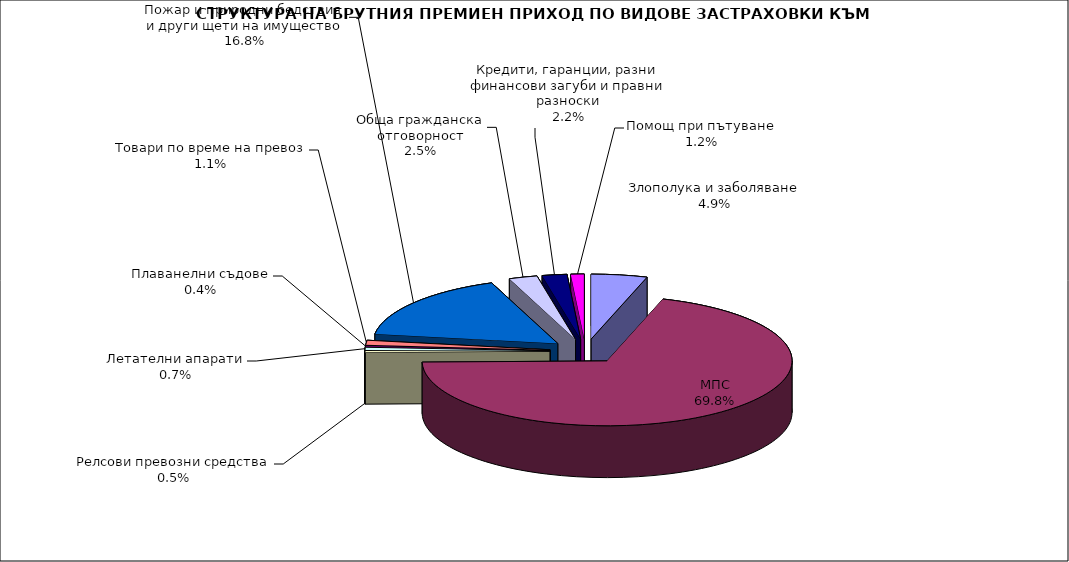
| Category | Злополука и заболяване МПС Релсови превозни средства Летателни апарати Плаванелни съдове Товари по време на превоз Пожар и природни бедствия и други щети на имущество Обща гражданска отговорност Кредити, гаранции, разни финансови загуби и правни разноски  |
|---|---|
| Злополука и заболяване | 0.049 |
| МПС | 0.698 |
| Релсови превозни средства | 0.005 |
| Летателни апарати | 0.007 |
| Плаванелни съдове | 0.004 |
| Товари по време на превоз | 0.011 |
| Пожар и природни бедствия и други щети на имущество | 0.168 |
| Обща гражданска отговорност | 0.025 |
| Кредити, гаранции, разни финансови загуби и правни разноски | 0.022 |
| Помощ при пътуване | 0.012 |